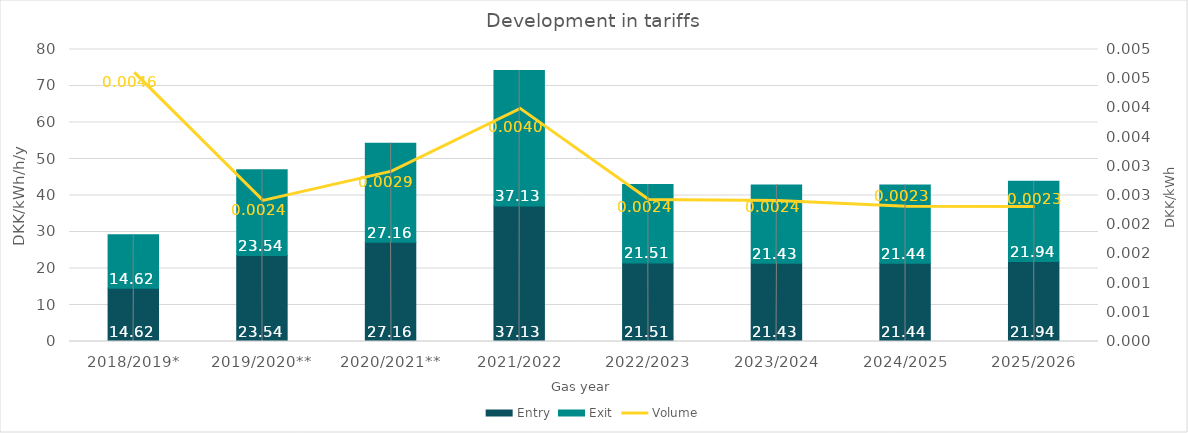
| Category | Entry | Exit |
|---|---|---|
| 2018/2019* | 14.62 | 14.62 |
| 2019/2020** | 23.54 | 23.54 |
| 2020/2021** | 27.162 | 27.162 |
| 2021/2022 | 37.128 | 37.128 |
| 2022/2023 | 21.508 | 21.508 |
| 2023/2024 | 21.432 | 21.432 |
| 2024/2025 | 21.441 | 21.441 |
| 2025/2026 | 21.937 | 21.937 |